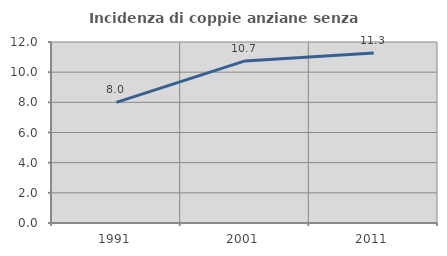
| Category | Incidenza di coppie anziane senza figli  |
|---|---|
| 1991.0 | 7.999 |
| 2001.0 | 10.747 |
| 2011.0 | 11.275 |